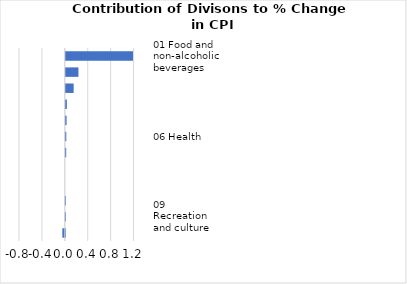
| Category |     Contributions |
|---|---|
| 01 Food and non-alcoholic beverages | 1.173 |
| 07 Transport | 0.221 |
| 04 Housing, water, electricity, gas and other fuels | 0.137 |
| 05 Furnishings, household equipment and maintenance | 0.018 |
| 12 Miscellaneous goods and services | 0.013 |
| 06 Health | 0.008 |
| 11 Restaurants and hotels | 0.007 |
| 08 Communication | 0 |
| 10 Education | 0 |
| 03 Clothing and footwear | -0.003 |
| 09 Recreation and culture | -0.003 |
| 02 Alcoholic beverages, tobacco and narcotics | -0.043 |